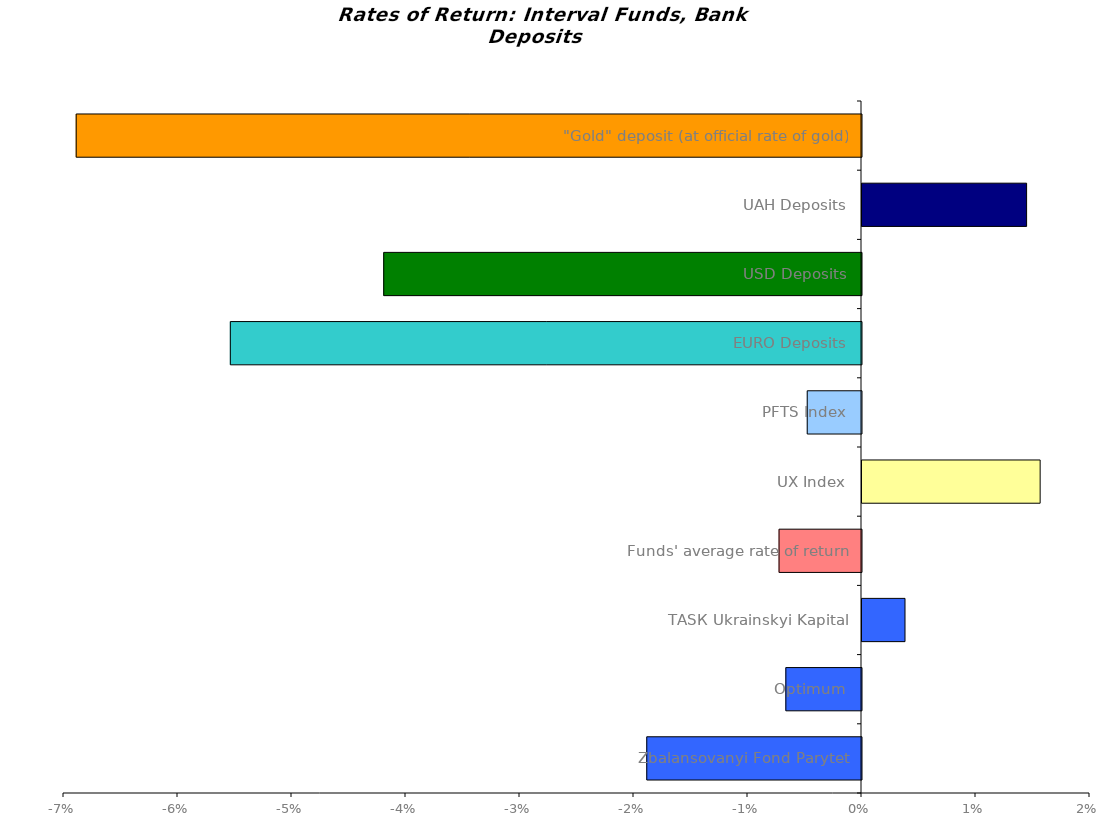
| Category | Series 0 |
|---|---|
| Zbalansovanyi Fond Parytet | -0.019 |
| Optimum | -0.007 |
| ТАSК Ukrainskyi Kapital | 0.004 |
| Funds' average rate of return | -0.007 |
| UX Index | 0.016 |
| PFTS Index | -0.005 |
| EURO Deposits | -0.055 |
| USD Deposits | -0.042 |
| UAH Deposits | 0.014 |
| "Gold" deposit (at official rate of gold) | -0.069 |